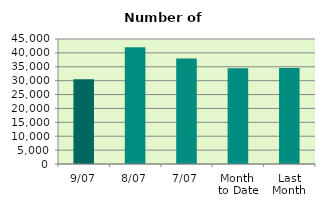
| Category | Series 0 |
|---|---|
| 9/07 | 30490 |
| 8/07 | 41986 |
| 7/07 | 37948 |
| Month 
to Date | 34469.714 |
| Last
Month | 34545 |